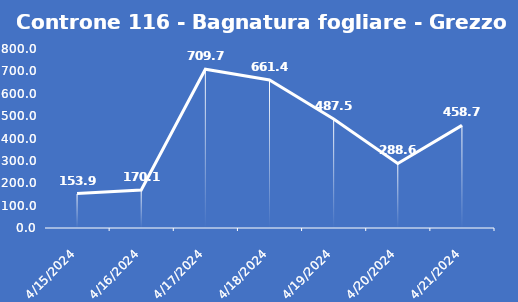
| Category | Controne 116 - Bagnatura fogliare - Grezzo (min) |
|---|---|
| 4/15/24 | 153.9 |
| 4/16/24 | 170.1 |
| 4/17/24 | 709.7 |
| 4/18/24 | 661.4 |
| 4/19/24 | 487.5 |
| 4/20/24 | 288.6 |
| 4/21/24 | 458.7 |